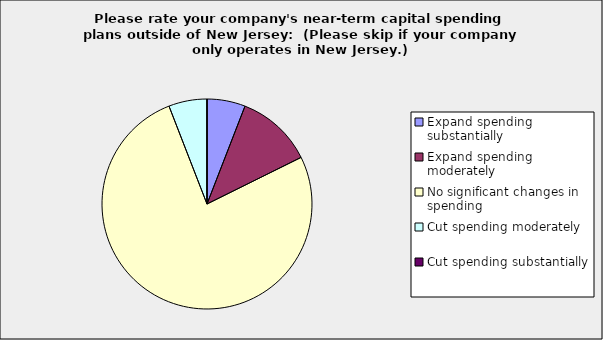
| Category | Series 0 |
|---|---|
| Expand spending substantially | 0.059 |
| Expand spending moderately | 0.118 |
| No significant changes in spending | 0.765 |
| Cut spending moderately | 0.059 |
| Cut spending substantially | 0 |